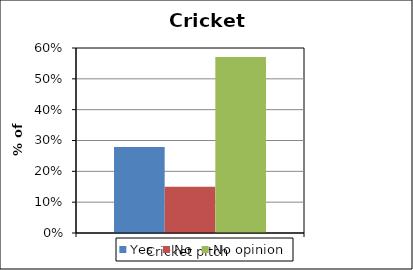
| Category | Yes | No | No opinion |
|---|---|---|---|
| Cricket pitch | 0.279 | 0.15 | 0.571 |